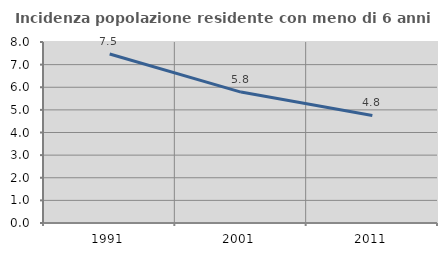
| Category | Incidenza popolazione residente con meno di 6 anni |
|---|---|
| 1991.0 | 7.471 |
| 2001.0 | 5.786 |
| 2011.0 | 4.752 |